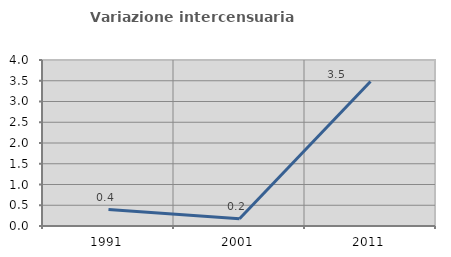
| Category | Variazione intercensuaria annua |
|---|---|
| 1991.0 | 0.396 |
| 2001.0 | 0.174 |
| 2011.0 | 3.481 |